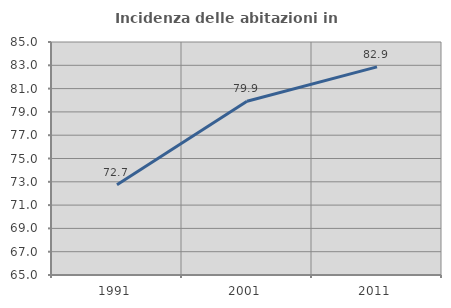
| Category | Incidenza delle abitazioni in proprietà  |
|---|---|
| 1991.0 | 72.741 |
| 2001.0 | 79.917 |
| 2011.0 | 82.861 |